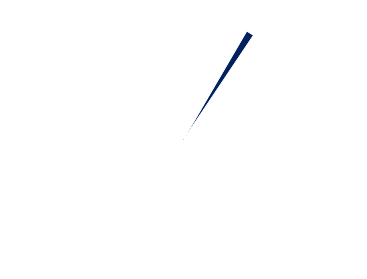
| Category | Series 0 |
|---|---|
| 0 | 67.493 |
| 1 | 2 |
| 2 | 132.507 |